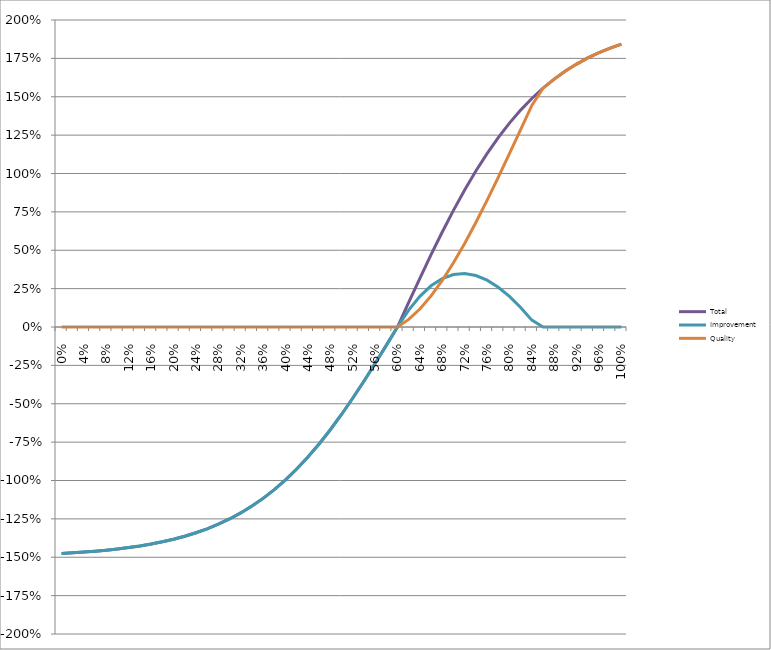
| Category | Total | Improvement | Quality |
|---|---|---|---|
| 0.0 | -1.476 | -1.476 | 0 |
| 0.02 | -1.471 | -1.471 | 0 |
| 0.04 | -1.466 | -1.466 | 0 |
| 0.06 | -1.461 | -1.461 | 0 |
| 0.08 | -1.454 | -1.454 | 0 |
| 0.1 | -1.446 | -1.446 | 0 |
| 0.12000000000000001 | -1.437 | -1.437 | 0 |
| 0.14 | -1.426 | -1.426 | 0 |
| 0.16 | -1.414 | -1.414 | 0 |
| 0.18 | -1.399 | -1.399 | 0 |
| 0.19999999999999998 | -1.383 | -1.383 | 0 |
| 0.21999999999999997 | -1.363 | -1.363 | 0 |
| 0.23999999999999996 | -1.341 | -1.341 | 0 |
| 0.25999999999999995 | -1.315 | -1.315 | 0 |
| 0.27999999999999997 | -1.285 | -1.285 | 0 |
| 0.3 | -1.25 | -1.25 | 0 |
| 0.32 | -1.211 | -1.211 | 0 |
| 0.34 | -1.167 | -1.167 | 0 |
| 0.36000000000000004 | -1.116 | -1.116 | 0 |
| 0.38000000000000006 | -1.06 | -1.06 | 0 |
| 0.4000000000000001 | -0.996 | -0.996 | 0 |
| 0.4200000000000001 | -0.925 | -0.925 | 0 |
| 0.4400000000000001 | -0.847 | -0.847 | 0 |
| 0.46000000000000013 | -0.762 | -0.762 | 0 |
| 0.48000000000000015 | -0.669 | -0.669 | 0 |
| 0.5000000000000001 | -0.57 | -0.57 | 0 |
| 0.5200000000000001 | -0.464 | -0.464 | 0 |
| 0.5400000000000001 | -0.353 | -0.353 | 0 |
| 0.5600000000000002 | -0.238 | -0.238 | 0 |
| 0.5800000000000002 | -0.12 | -0.12 | 0 |
| 0.6000000000000002 | 0 | 0 | 0 |
| 0.6200000000000002 | 0.16 | 0.11 | 0.049 |
| 0.6400000000000002 | 0.317 | 0.2 | 0.117 |
| 0.6600000000000003 | 0.471 | 0.268 | 0.203 |
| 0.6800000000000003 | 0.619 | 0.316 | 0.303 |
| 0.7000000000000003 | 0.76 | 0.342 | 0.418 |
| 0.7200000000000003 | 0.892 | 0.348 | 0.544 |
| 0.7400000000000003 | 1.016 | 0.335 | 0.681 |
| 0.7600000000000003 | 1.13 | 0.305 | 0.825 |
| 0.7800000000000004 | 1.234 | 0.259 | 0.975 |
| 0.8000000000000004 | 1.328 | 0.199 | 1.129 |
| 0.8200000000000004 | 1.413 | 0.127 | 1.286 |
| 0.8400000000000004 | 1.489 | 0.045 | 1.444 |
| 0.8600000000000004 | 1.556 | 0 | 1.556 |
| 0.8800000000000004 | 1.615 | 0 | 1.615 |
| 0.9000000000000005 | 1.667 | 0 | 1.667 |
| 0.9200000000000005 | 1.713 | 0 | 1.713 |
| 0.9400000000000005 | 1.753 | 0 | 1.753 |
| 0.9600000000000005 | 1.787 | 0 | 1.787 |
| 0.9800000000000005 | 1.817 | 0 | 1.817 |
| 1.0000000000000004 | 1.843 | 0 | 1.843 |